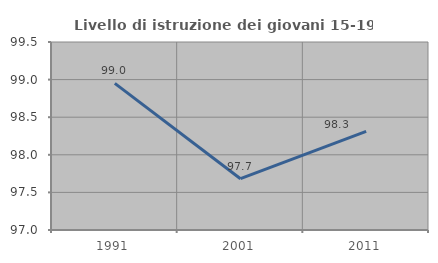
| Category | Livello di istruzione dei giovani 15-19 anni |
|---|---|
| 1991.0 | 98.95 |
| 2001.0 | 97.682 |
| 2011.0 | 98.311 |